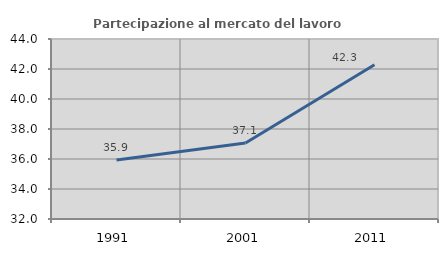
| Category | Partecipazione al mercato del lavoro  femminile |
|---|---|
| 1991.0 | 35.93 |
| 2001.0 | 37.064 |
| 2011.0 | 42.288 |